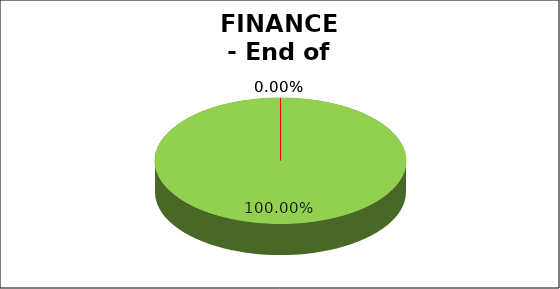
| Category | Q4 |
|---|---|
| Green | 1 |
| Amber | 0 |
| Red | 0 |